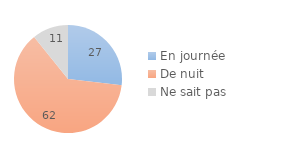
| Category | Series 0 |
|---|---|
| En journée | 26.86 |
| De nuit | 62.351 |
| Ne sait pas | 10.789 |